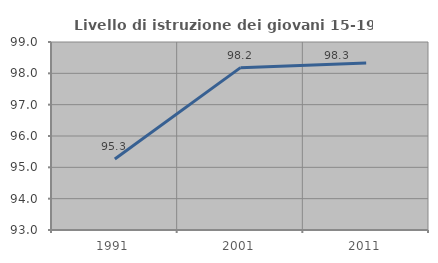
| Category | Livello di istruzione dei giovani 15-19 anni |
|---|---|
| 1991.0 | 95.263 |
| 2001.0 | 98.182 |
| 2011.0 | 98.333 |